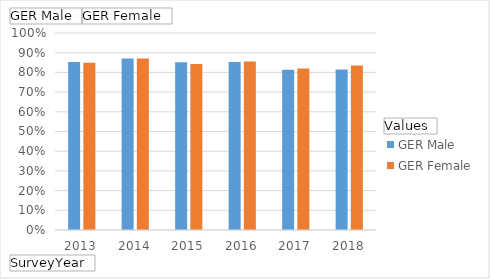
| Category | GER Male | GER Female |
|---|---|---|
| 2013 | 0.853 | 0.849 |
| 2014 | 0.87 | 0.87 |
| 2015 | 0.851 | 0.843 |
| 2016 | 0.853 | 0.855 |
| 2017 | 0.813 | 0.82 |
| 2018 | 0.815 | 0.834 |